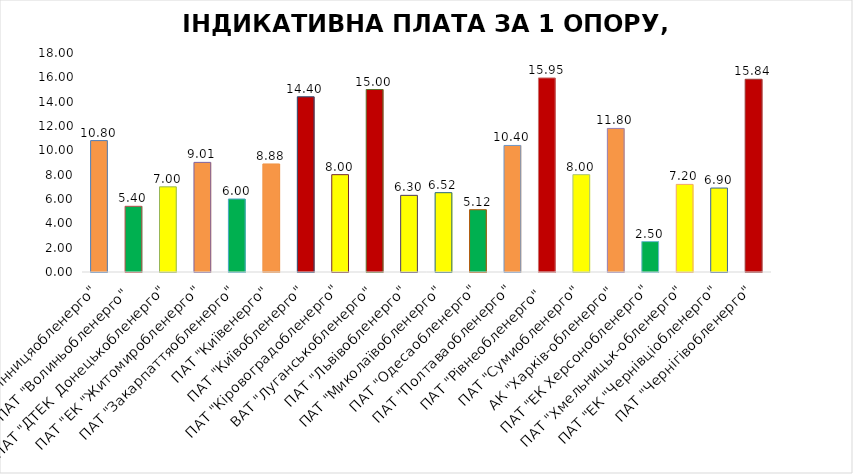
| Category | Series 0 |
|---|---|
| ПАТ "Вінницяобленерго" | 10.8 |
| ПАТ "Волиньобленерго"  | 5.4 |
| ПАТ "ДТЕК  Донецькобленерго" | 7 |
| ПАТ "ЕК "Житомиробленерго" | 9.01 |
| ПАТ "Закарпаттяобленерго" | 6 |
| ПАТ "Київенерго" | 8.88 |
| ПАТ "Київобленерго" | 14.4 |
| ПАТ "Кіровоградобленерго" | 8 |
| ВАТ "Луганськобленерго" | 15 |
| ПАТ "Львівобленерго" | 6.3 |
| ПАТ "Миколаївобленерго" | 6.52 |
| ПАТ "Одесаобленерго" | 5.12 |
| ПАТ "Полтаваобленерго" | 10.4 |
| ПАТ "Рівнеобленерго"  | 15.95 |
| ПАТ "Сумиобленерго" | 8 |
| АК "Харків-обленерго" | 11.8 |
| ПАТ "ЕК Херсонобленерго" | 2.5 |
| ПАТ "Хмельницьк-обленерго" | 7.2 |
| ПАТ "ЕК "Чернівціобленерго" | 6.9 |
| ПАТ "Чернігівобленерго" | 15.84 |